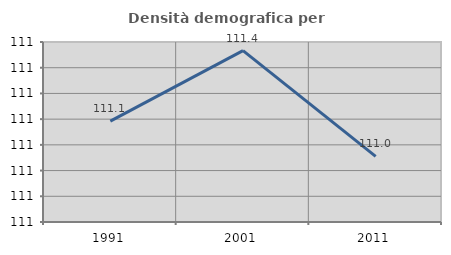
| Category | Densità demografica |
|---|---|
| 1991.0 | 111.092 |
| 2001.0 | 111.366 |
| 2011.0 | 110.955 |